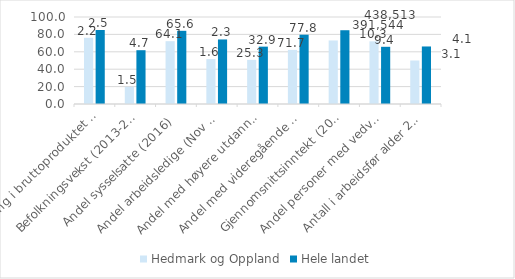
| Category | Hedmark og Oppland | Hele landet |
|---|---|---|
| Endring i bruttoproduktet (2010-2015) | 76.067 | 85.077 |
| Befolkningsvekst (2013-2018) | 19.737 | 61.842 |
| Andel sysselsatte (2016) | 72.222 | 84.127 |
| Andel arbeidsledige (Nov 2017) | 51.613 | 74.194 |
| Andel med høyere utdanning, 16 år og over (2016) | 50.701 | 65.932 |
| Andel med videregående og høyere utdanning, 25-29 år (2016) | 62.178 | 79.656 |
| Gjennomsnittsinntekt (2016) | 73.032 | 84.798 |
| Andel personer med vedvarende lavinntekt (2014-16) | 72.028 | 65.734 |
| Antall i arbeidsfør alder 20-66 år i forhold til eldre 67 år og over (2018) | 50 | 66.129 |